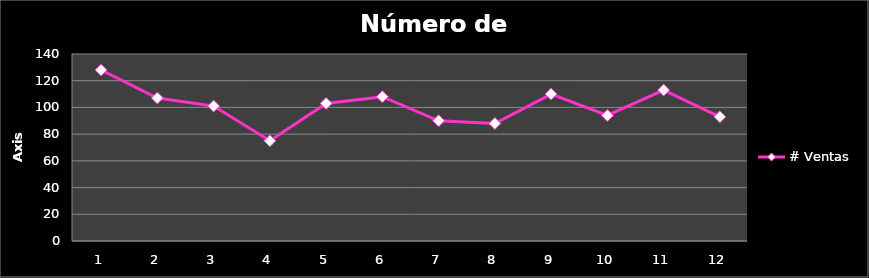
| Category | # Ventas |
|---|---|
| 0 | 128 |
| 1 | 107 |
| 2 | 101 |
| 3 | 75 |
| 4 | 103 |
| 5 | 108 |
| 6 | 90 |
| 7 | 88 |
| 8 | 110 |
| 9 | 94 |
| 10 | 113 |
| 11 | 93 |